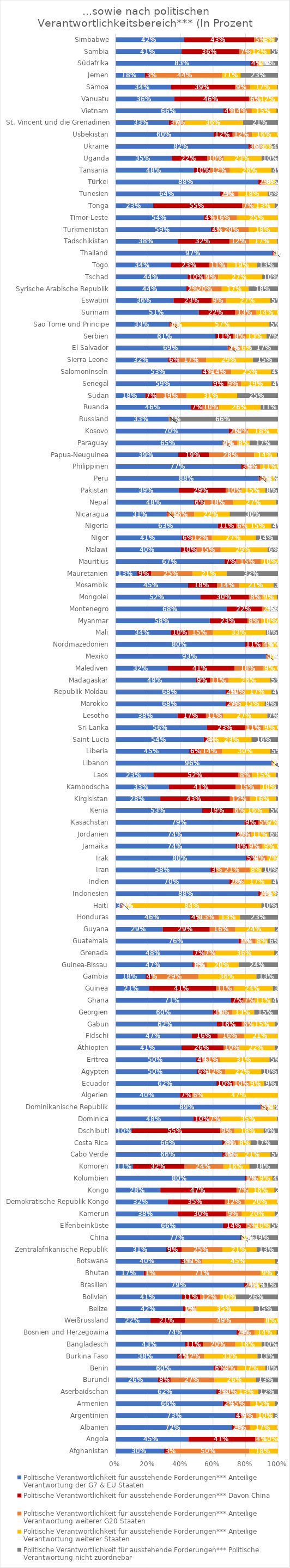
| Category | Politische Verantwortlichkeit für ausstehende Forderungen*** |
|---|---|
| Afghanistan | 0 |
| Angola | 0.002 |
| Albanien | 0.005 |
| Argentinien | 0.03 |
| Armenien | 0.018 |
| Aserbaidschan | 0.121 |
| Burundi | 0.135 |
| Benin | 0.078 |
| Burkina Faso | 0.126 |
| Bangladesch | 0.101 |
| Bosnien und Herzegowina | 0.009 |
| Weißrussland | 0 |
| Belize | 0.151 |
| Bolivien | 0.26 |
| Brasilien | 0.111 |
| Bhutan | 0.016 |
| Botswana | 0.017 |
| Zentralafrikanische Republik | 0.132 |
| China | 0.193 |
| Elfenbeinküste | 0.046 |
| Kamerun | 0.021 |
| Demokratische Republik Kongo | 0.005 |
| Kongo | 0.023 |
| Kolumbien | 0.036 |
| Komoren | 0.177 |
| Cabo Verde | 0.047 |
| Costa Rica | 0.169 |
| Dschibuti | 0.089 |
| Dominica | 0.006 |
| Dominikanische Republik | 0.02 |
| Algerien | 0 |
| Ecuador | 0.086 |
| Ägypten | 0.103 |
| Eritrea | 0.053 |
| Äthiopien | 0.018 |
| Fidschi | 0 |
| Gabun | 0.018 |
| Georgien | 0.147 |
| Ghana | 0.039 |
| Guinea | 0.032 |
| Gambia | 0.133 |
| Guinea-Bissau | 0.242 |
| Grenada | 0.023 |
| Guatemala | 0.062 |
| Guyana | 0.021 |
| Honduras | 0.234 |
| Haiti | 0.103 |
| Indonesien | 0.012 |
| Indien | 0.04 |
| Iran | 0.098 |
| Irak | 0 |
| Jamaika | 0.002 |
| Jordanien | 0.058 |
| Kasachstan | 0 |
| Kenia | 0.055 |
| Kirgisistan | 0.012 |
| Kambodscha | 0.014 |
| Laos | 0.014 |
| Libanon | 0.013 |
| Liberia | 0.049 |
| Saint Lucia | 0.164 |
| Sri Lanka | 0.004 |
| Lesotho | 0.066 |
| Marokko | 0.083 |
| Republik Moldau | 0.04 |
| Madagaskar | 0.049 |
| Malediven | 0.005 |
| Mexiko | 0.023 |
| Nordmazedonien | 0.002 |
| Mali | 0.076 |
| Myanmar | 0.003 |
| Montenegro | 0.054 |
| Mongolei | 0.008 |
| Mosambik | 0.027 |
| Mauretanien | 0.316 |
| Mauritius | 0.003 |
| Malawi | 0.064 |
| Niger | 0.137 |
| Nigeria | 0.041 |
| Nicaragua | 0.298 |
| Nepal | 0.012 |
| Pakistan | 0.079 |
| Peru | 0.022 |
| Philippinen | 0.002 |
| Papua-Neuguinea | 0.007 |
| Paraguay | 0.174 |
| Kosovo | 0 |
| Russland | 0.665 |
| Ruanda | 0.106 |
| Sudan | 0.252 |
| Senegal | 0.04 |
| Salomoninseln | 0.042 |
| Sierra Leone | 0.154 |
| El Salvador | 0.168 |
| Serbien | 0.071 |
| Sao Tome und Principe | 0.053 |
| Surinam | 0 |
| Eswatini | 0.048 |
| Syrische Arabische Republik | 0.181 |
| Tschad | 0.097 |
| Togo | 0.128 |
| Thailand | 0 |
| Tadschikistan | 0.006 |
| Turkmenistan | 0 |
| Timor-Leste | 0 |
| Tonga | 0.02 |
| Tunesien | 0.064 |
| Türkei | 0.016 |
| Tansania | 0.041 |
| Uganda | 0.102 |
| Ukraine | 0.038 |
| Usbekistan | 0.003 |
| St. Vincent und die Grenadinen | 0.215 |
| Vietnam | 0.01 |
| Vanuatu | 0 |
| Samoa | 0.005 |
| Jemen | 0.231 |
| Südafrika | 0.091 |
| Sambia | 0.046 |
| Simbabwe | 0.018 |